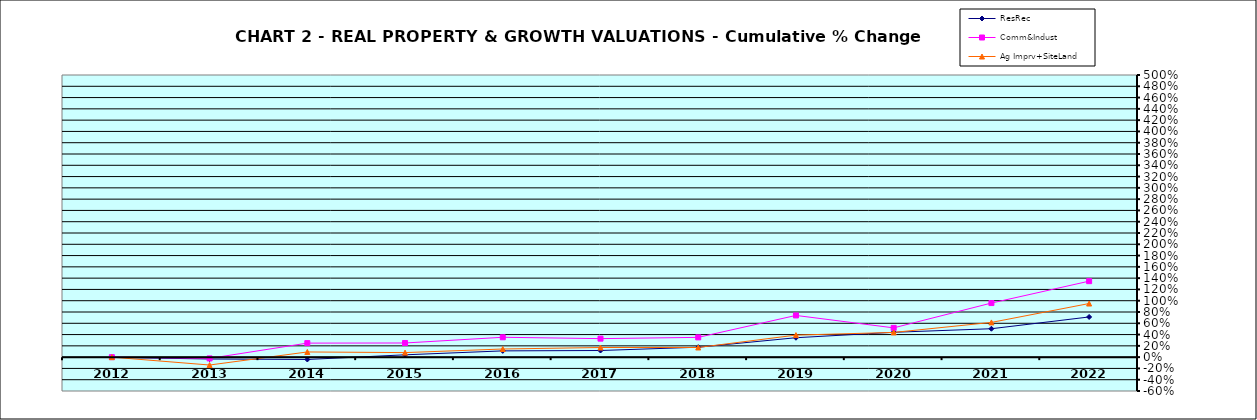
| Category | ResRec | Comm&Indust | Ag Imprv+SiteLand |
|---|---|---|---|
| 2012.0 | -0.004 | 0 | 0 |
| 2013.0 | -0.033 | -0.022 | -0.14 |
| 2014.0 | -0.041 | 0.249 | 0.092 |
| 2015.0 | 0.041 | 0.251 | 0.081 |
| 2016.0 | 0.111 | 0.352 | 0.144 |
| 2017.0 | 0.118 | 0.328 | 0.171 |
| 2018.0 | 0.176 | 0.35 | 0.171 |
| 2019.0 | 0.344 | 0.739 | 0.391 |
| 2020.0 | 0.44 | 0.519 | 0.438 |
| 2021.0 | 0.504 | 0.958 | 0.616 |
| 2022.0 | 0.712 | 1.347 | 0.95 |